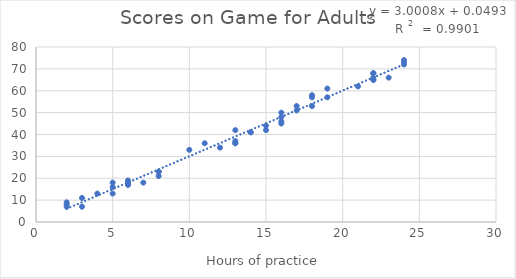
| Category | Score |
|---|---|
| 2.0 | 7 |
| 2.0 | 9 |
| 2.0 | 8 |
| 3.0 | 11 |
| 3.0 | 7 |
| 4.0 | 13 |
| 5.0 | 18 |
| 5.0 | 16 |
| 5.0 | 13 |
| 6.0 | 19 |
| 6.0 | 18 |
| 6.0 | 18 |
| 6.0 | 17 |
| 6.0 | 17 |
| 7.0 | 18 |
| 8.0 | 21 |
| 8.0 | 23 |
| 8.0 | 23 |
| 10.0 | 33 |
| 11.0 | 36 |
| 12.0 | 34 |
| 13.0 | 37 |
| 13.0 | 36 |
| 13.0 | 42 |
| 13.0 | 36 |
| 14.0 | 41 |
| 14.0 | 41 |
| 15.0 | 42 |
| 15.0 | 44 |
| 16.0 | 48 |
| 16.0 | 46 |
| 16.0 | 45 |
| 16.0 | 50 |
| 17.0 | 53 |
| 17.0 | 51 |
| 18.0 | 57 |
| 18.0 | 58 |
| 18.0 | 53 |
| 19.0 | 57 |
| 19.0 | 61 |
| 21.0 | 62 |
| 22.0 | 68 |
| 22.0 | 66 |
| 22.0 | 68 |
| 22.0 | 65 |
| 22.0 | 65 |
| 23.0 | 66 |
| 24.0 | 72 |
| 24.0 | 74 |
| 24.0 | 73 |